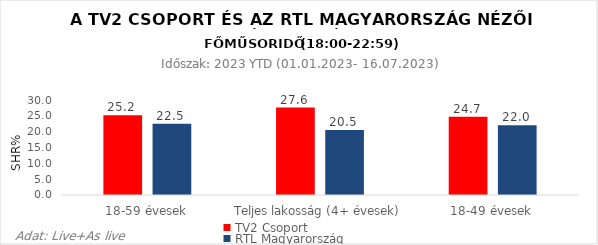
| Category | TV2 Csoport | RTL Magyarország |
|---|---|---|
| 18-59 évesek | 25.2 | 22.5 |
| Teljes lakosság (4+ évesek) | 27.6 | 20.5 |
| 18-49 évesek | 24.7 | 22 |